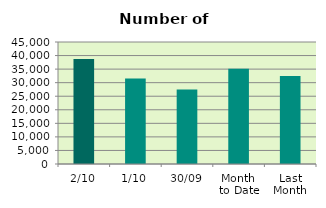
| Category | Series 0 |
|---|---|
| 2/10 | 38686 |
| 1/10 | 31528 |
| 30/09 | 27446 |
| Month 
to Date | 35107 |
| Last
Month | 32492.381 |